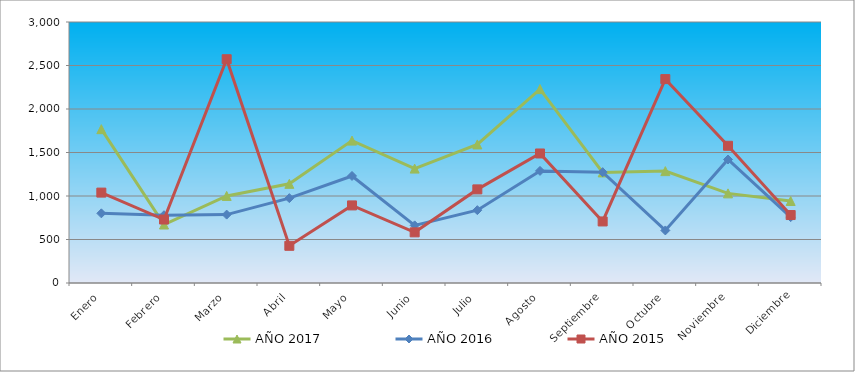
| Category | AÑO 2017 | AÑO 2016 | AÑO 2015 |
|---|---|---|---|
| Enero | 1768.146 | 800.753 | 1039.144 |
| Febrero | 672.188 | 778.914 | 729.612 |
| Marzo | 1000.975 | 786.194 | 2572.065 |
| Abril | 1139.797 | 975.463 | 427.449 |
| Mayo | 1636.631 | 1230.248 | 891.748 |
| Junio | 1315.15 | 662.441 | 582.215 |
| Julio | 1592.793 | 837.151 | 1075.993 |
| Agosto | 2228.449 | 1288.485 | 1488.703 |
| Septiembre | 1271.312 | 1273.926 | 707.502 |
| Octubre | 1285.925 | 604.205 | 2343.601 |
| Noviembre | 1030.201 | 1419.517 | 1577.14 |
| Diciembre | 942.524 | 757.076 | 781.2 |